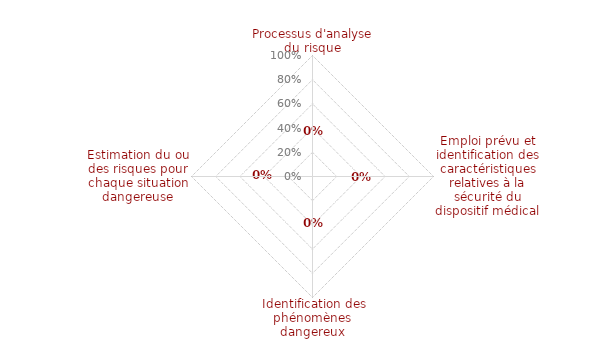
| Category | article 5 |
|---|---|
| 0 | 0 |
| 1 | 0 |
| 2 | 0 |
| 3 | 0 |